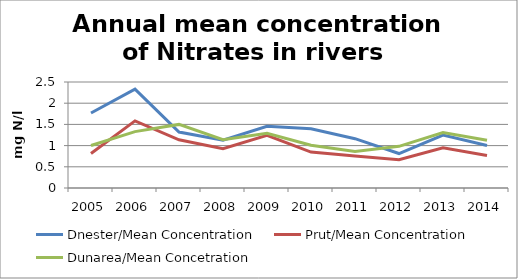
| Category | Dnester/Mean Concentration  | Prut/Mean Concentration | Dunarea/Mean Concetration |
|---|---|---|---|
| 2005.0 | 1.768 | 0.815 | 1.002 |
| 2006.0 | 2.33 | 1.583 | 1.33 |
| 2007.0 | 1.32 | 1.137 | 1.5 |
| 2008.0 | 1.125 | 0.927 | 1.14 |
| 2009.0 | 1.457 | 1.243 | 1.29 |
| 2010.0 | 1.397 | 0.847 | 1.01 |
| 2011.0 | 1.163 | 0.753 | 0.859 |
| 2012.0 | 0.813 | 0.666 | 0.983 |
| 2013.0 | 1.25 | 0.946 | 1.31 |
| 2014.0 | 1.004 | 0.768 | 1.126 |